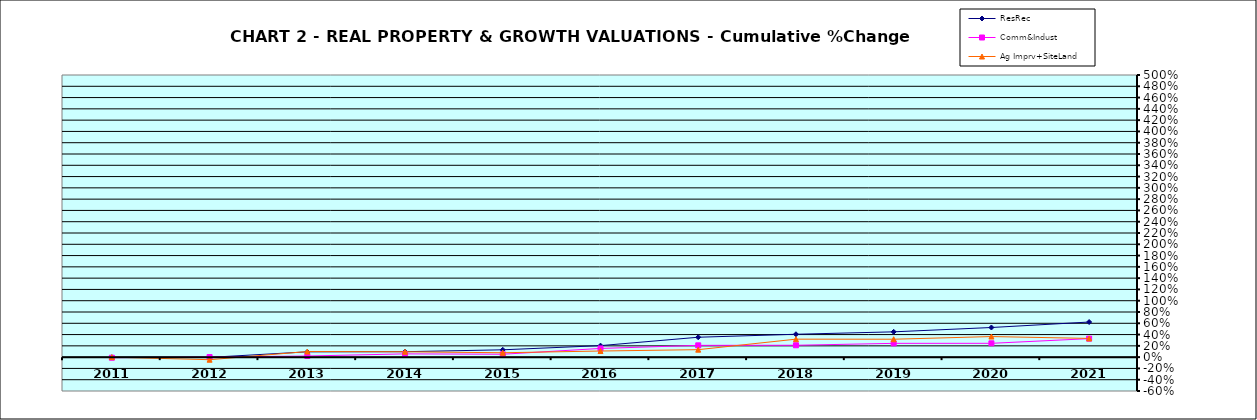
| Category | ResRec | Comm&Indust | Ag Imprv+SiteLand |
|---|---|---|---|
| 2011.0 | -0.003 | -0.01 | 0 |
| 2012.0 | -0.004 | 0.001 | -0.046 |
| 2013.0 | 0.094 | 0.02 | 0.099 |
| 2014.0 | 0.097 | 0.058 | 0.095 |
| 2015.0 | 0.13 | 0.052 | 0.078 |
| 2016.0 | 0.204 | 0.154 | 0.108 |
| 2017.0 | 0.353 | 0.209 | 0.133 |
| 2018.0 | 0.405 | 0.211 | 0.319 |
| 2019.0 | 0.448 | 0.244 | 0.317 |
| 2020.0 | 0.525 | 0.245 | 0.365 |
| 2021.0 | 0.622 | 0.328 | 0.332 |